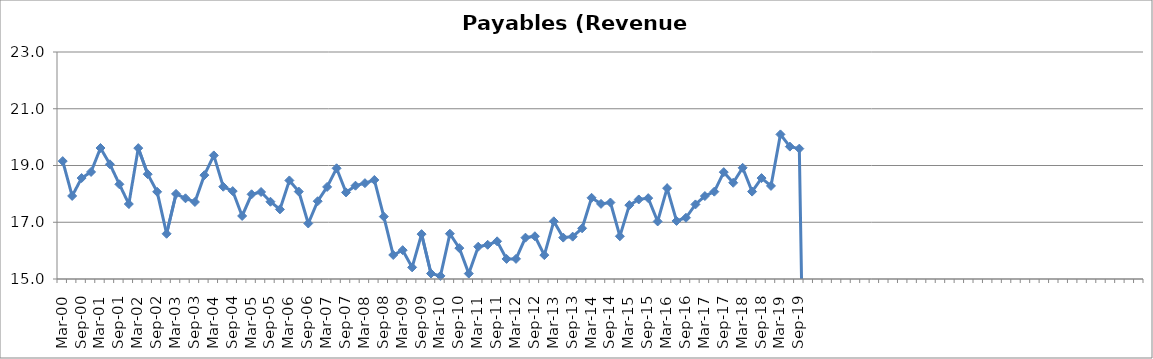
| Category | Payables (Revenue Days) |
|---|---|
| Mar-00 | 19.155 |
| Jun-00 | 17.927 |
| Sep-00 | 18.558 |
| Dec-00 | 18.773 |
| Mar-01 | 19.617 |
| Jun-01 | 19.042 |
| Sep-01 | 18.338 |
| Dec-01 | 17.642 |
| Mar-02 | 19.612 |
| Jun-02 | 18.694 |
| Sep-02 | 18.073 |
| Dec-02 | 16.594 |
| Mar-03 | 18 |
| Jun-03 | 17.844 |
| Sep-03 | 17.714 |
| Dec-03 | 18.66 |
| Mar-04 | 19.355 |
| Jun-04 | 18.252 |
| Sep-04 | 18.098 |
| Dec-04 | 17.222 |
| Mar-05 | 17.985 |
| Jun-05 | 18.067 |
| Sep-05 | 17.723 |
| Dec-05 | 17.454 |
| Mar-06 | 18.473 |
| Jun-06 | 18.081 |
| Sep-06 | 16.957 |
| Dec-06 | 17.741 |
| Mar-07 | 18.245 |
| Jun-07 | 18.902 |
| Sep-07 | 18.052 |
| Dec-07 | 18.288 |
| Mar-08 | 18.378 |
| Jun-08 | 18.49 |
| Sep-08 | 17.2 |
| Dec-08 | 15.846 |
| Mar-09 | 16.016 |
| Jun-09 | 15.41 |
| Sep-09 | 16.581 |
| Dec-09 | 15.193 |
| Mar-10 | 15.109 |
| Jun-10 | 16.596 |
| Sep-10 | 16.088 |
| Dec-10 | 15.191 |
| Mar-11 | 16.138 |
| Jun-11 | 16.205 |
| Sep-11 | 16.327 |
| Dec-11 | 15.707 |
| Mar-12 | 15.709 |
| Jun-12 | 16.456 |
| Sep-12 | 16.507 |
| Dec-12 | 15.842 |
| Mar-13 | 17.033 |
| Jun-13 | 16.459 |
| Sep-13 | 16.493 |
| Dec-13 | 16.786 |
| Mar-14 | 17.862 |
| Jun-14 | 17.648 |
| Sep-14 | 17.695 |
| Dec-14 | 16.506 |
| Mar-15 | 17.604 |
| Jun-15 | 17.803 |
| Sep-15 | 17.85 |
| Dec-15 | 17.028 |
| Mar-16 | 18.201 |
| Jun-16 | 17.046 |
| Sep-16 | 17.158 |
| Dec-16 | 17.628 |
| Mar-17 | 17.923 |
| Jun-17 | 18.078 |
| Sep-17 | 18.766 |
| Dec-17 | 18.391 |
| Mar-18 | 18.919 |
| Jun-18 | 18.08 |
| Sep-18 | 18.557 |
| Dec-18 | 18.28 |
| Mar-19 | 20.096 |
| Jun-19 | 19.666 |
| Sep-19 | 19.594 |